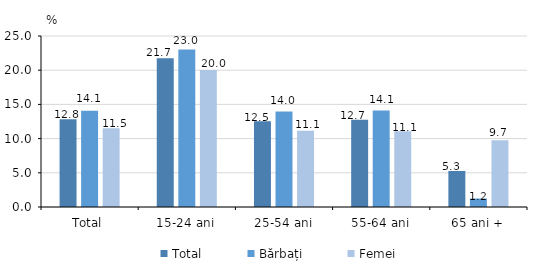
| Category | Total | Bărbați | Femei |
|---|---|---|---|
| Total | 12.829 | 14.085 | 11.506 |
| 15-24 ani | 21.748 | 23.044 | 20.027 |
| 25-54 ani | 12.548 | 13.957 | 11.147 |
| 55-64 ani | 12.74 | 14.094 | 11.082 |
| 65 ani + | 5.268 | 1.242 | 9.746 |